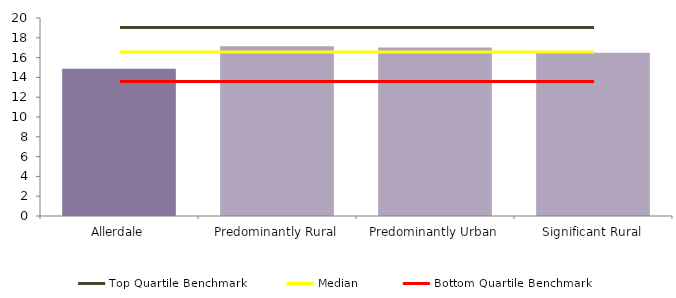
| Category | Series 0 |
|---|---|
| Allerdale | 14.884 |
| Predominantly Rural | 17.144 |
| Predominantly Urban | 17.014 |
| Significant Rural | 16.498 |